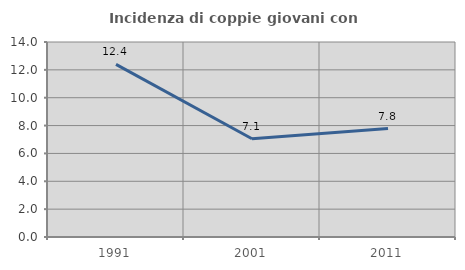
| Category | Incidenza di coppie giovani con figli |
|---|---|
| 1991.0 | 12.393 |
| 2001.0 | 7.054 |
| 2011.0 | 7.787 |